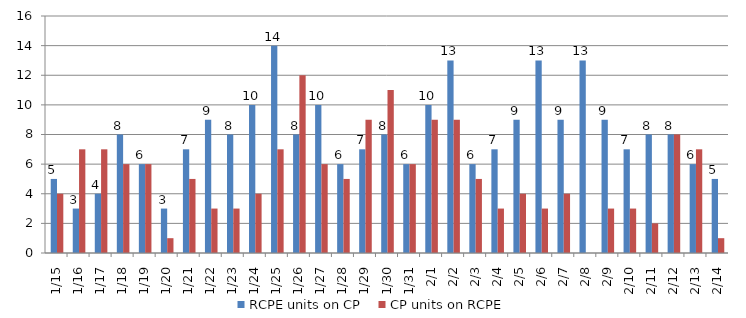
| Category | RCPE units on CP | CP units on RCPE |
|---|---|---|
| 2015-01-15 | 5 | 4 |
| 2015-01-16 | 3 | 7 |
| 2015-01-17 | 4 | 7 |
| 2015-01-18 | 8 | 6 |
| 2015-01-19 | 6 | 6 |
| 2015-01-20 | 3 | 1 |
| 2015-01-21 | 7 | 5 |
| 2015-01-22 | 9 | 3 |
| 2015-01-23 | 8 | 3 |
| 2015-01-24 | 10 | 4 |
| 2015-01-25 | 14 | 7 |
| 2015-01-26 | 8 | 12 |
| 2015-01-27 | 10 | 6 |
| 2015-01-28 | 6 | 5 |
| 2015-01-29 | 7 | 9 |
| 2015-01-30 | 8 | 11 |
| 2015-01-31 | 6 | 6 |
| 2015-02-01 | 10 | 9 |
| 2015-02-02 | 13 | 9 |
| 2015-02-03 | 6 | 5 |
| 2015-02-04 | 7 | 3 |
| 2015-02-05 | 9 | 4 |
| 2015-02-06 | 13 | 3 |
| 2015-02-07 | 9 | 4 |
| 2015-02-08 | 13 | 0 |
| 2015-02-09 | 9 | 3 |
| 2015-02-10 | 7 | 3 |
| 2015-02-11 | 8 | 2 |
| 2015-02-12 | 8 | 8 |
| 2015-02-13 | 6 | 7 |
| 2015-02-14 | 5 | 1 |